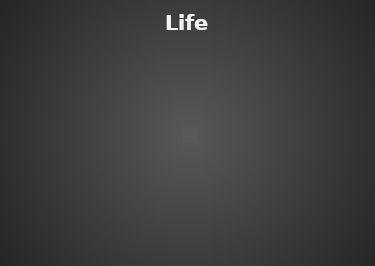
| Category | Life Science |
|---|---|
| % of Students passed | 0 |
| % of Students need improvement | 0 |